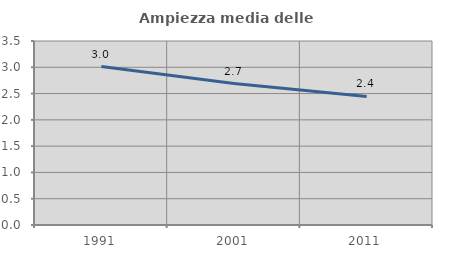
| Category | Ampiezza media delle famiglie |
|---|---|
| 1991.0 | 3.013 |
| 2001.0 | 2.691 |
| 2011.0 | 2.447 |